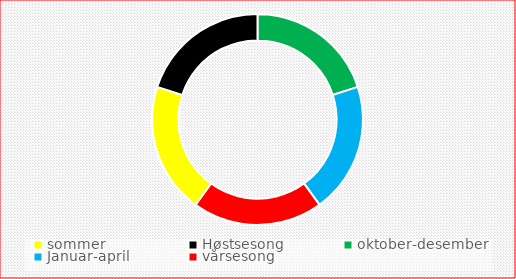
| Category | Series 0 | Series 1 |
|---|---|---|
| sommer |  | 10 |
| Høstsesong |  | 10 |
| oktober-desember |  | 10 |
| Januar-april |  | 10 |
| vårsesong |  | 10 |